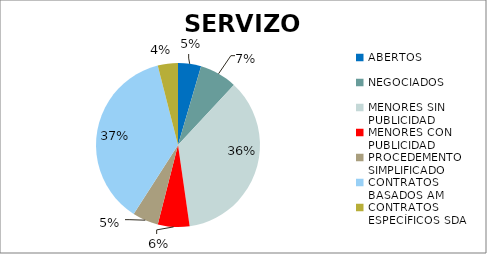
| Category | Series 0 |
|---|---|
| ABERTOS  | 0.045 |
| NEGOCIADOS  | 0.074 |
| MENORES SIN PUBLICIDAD | 0.358 |
| MENORES CON PUBLICIDAD | 0.062 |
| PROCEDEMENTO SIMPLIFICADO | 0.051 |
| CONTRATOS BASADOS AM | 0.369 |
| CONTRATOS ESPECÍFICOS SDA | 0.04 |